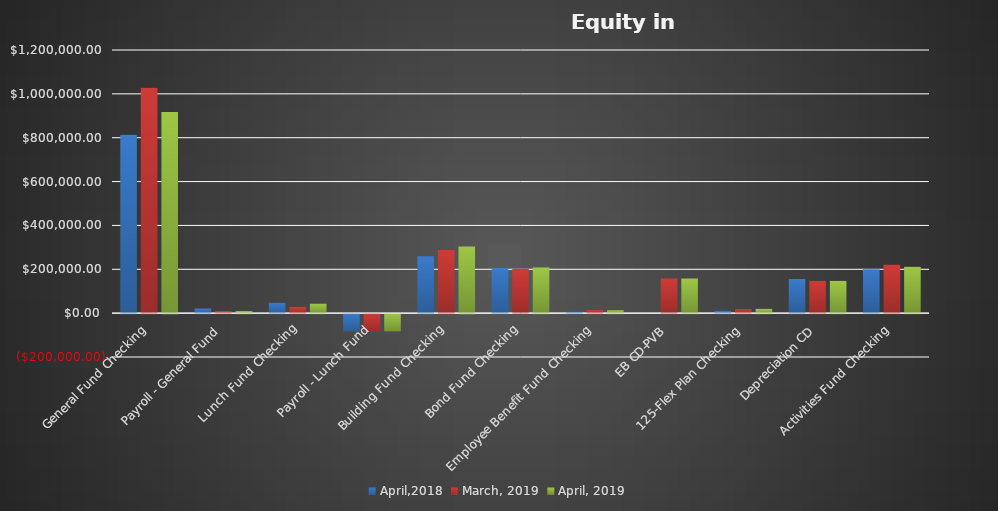
| Category | April,2018 | March, 2019 | April, 2019 |
|---|---|---|---|
| General Fund Checking | 813399.77 | 1027892.4 | 916987.24 |
| Payroll - General Fund | 21223.49 | 9505.28 | 9512.61 |
| Lunch Fund Checking | 47642.71 | 29873.73 | 43739.49 |
| Payroll - Lunch Fund | -77705.05 | -77705.05 | -77705.05 |
| Building Fund Checking | 259829.61 | 289959.12 | 304078.81 |
| Bond Fund Checking | 205391.45 | 201605.09 | 208542.42 |
| Employee Benefit Fund Checking | 6456.98 | 14365.98 | 13204.99 |
| EB CD-PVB | 0 | 158067.29 | 158067.29 |
| 125-Flex Plan Checking | 11151 | 17833.23 | 19728.1 |
| Depreciation CD | 155645 | 147130.67 | 147130.67 |
| Activities Fund Checking | 200011.33 | 221341.54 | 211590.51 |